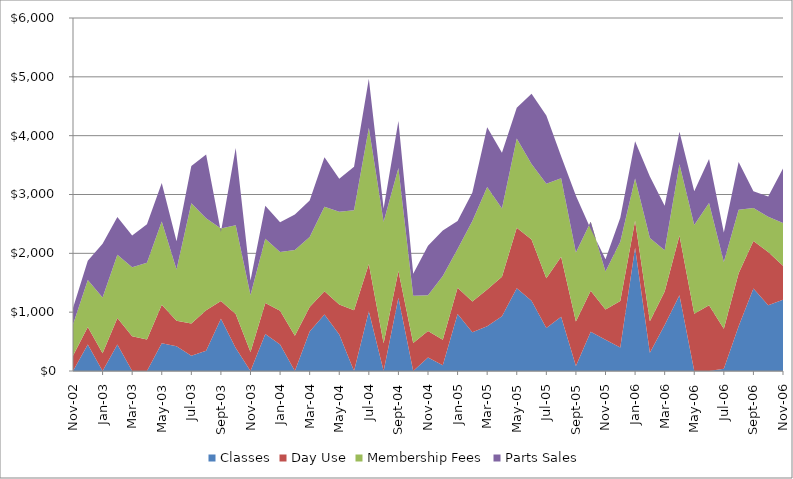
| Category | Classes | Day Use | Membership Fees | Parts Sales |
|---|---|---|---|---|
| 2002-11-30 | 0 | 260 | 532 | 277.02 |
| 2002-12-31 | 450 | 300 | 795 | 329.13 |
| 2003-01-31 | 0 | 300.23 | 947 | 913.68 |
| 2003-02-28 | 450 | 451 | 1075.06 | 642.99 |
| 2003-03-31 | 0 | 589 | 1175 | 539.37 |
| 2003-04-30 | 0 | 536.49 | 1302 | 654.8 |
| 2003-05-31 | 473.09 | 651 | 1418 | 653.2 |
| 2003-06-30 | 419.68 | 434 | 871 | 479.28 |
| 2003-07-31 | 257.61 | 549 | 2045 | 634.13 |
| 2003-08-31 | 345.45 | 685.5 | 1563.91 | 1084.85 |
| 2003-09-30 | 887.52 | 304 | 1230 | -58.87 |
| 2003-10-31 | 390 | 580 | 1507 | 1311.77 |
| 2003-11-30 | 0 | 325 | 965 | 250.24 |
| 2003-12-31 | 630 | 526 | 1091 | 562.84 |
| 2004-01-31 | 450 | 574 | 997 | 507.45 |
| 2004-02-29 | 0 | 598 | 1460 | 603.54 |
| 2004-03-31 | 670 | 418 | 1189 | 622 |
| 2004-04-30 | 960 | 396 | 1434 | 842.39 |
| 2004-05-31 | 620 | 510 | 1577 | 559.38 |
| 2004-06-30 | 0 | 1032.68 | 1698.14 | 738.73 |
| 2004-07-31 | 1015.19 | 805.04 | 2314.76 | 832.11 |
| 2004-08-31 | 0 | 470.34 | 2066.79 | 226.81 |
| 2004-09-30 | 1243.53 | 455.46 | 1749.35 | 801.28 |
| 2004-10-31 | 0 | 475.27 | 803.23 | 376.34 |
| 2004-11-30 | 230 | 451.49 | 606.5 | 839.46 |
| 2004-12-31 | 98.46 | 433.87 | 1082.52 | 771.46 |
| 2005-01-31 | 970 | 445.05 | 656.95 | 475.89 |
| 2005-02-28 | 660 | 520.07 | 1371.01 | 482.73 |
| 2005-03-31 | 760 | 627.28 | 1741.91 | 1012.32 |
| 2005-04-30 | 930 | 673.14 | 1158.53 | 948.78 |
| 2005-05-31 | 1408.4 | 1027 | 1516.02 | 523.92 |
| 2005-06-30 | 1194.49 | 1038.84 | 1283.72 | 1194.57 |
| 2005-07-31 | 731.76 | 844.97 | 1604.43 | 1161.1 |
| 2005-08-31 | 923.31 | 1017.09 | 1335.64 | 373.94 |
| 2005-09-30 | 86.81 | 752.93 | 1172.6 | 966.59 |
| 2005-10-31 | 667.66 | 697.14 | 1172.48 | -124.8 |
| 2005-11-30 | 532.29 | 511.63 | 647.79 | 206.83 |
| 2005-12-31 | 399 | 789.87 | 1006.42 | 407.93 |
| 2006-01-31 | 2096 | 457.38 | 719.62 | 631.86 |
| 2006-02-28 | 310.34 | 535.97 | 1415.27 | 1045.76 |
| 2006-03-31 | 780 | 572.45 | 698.06 | 756.65 |
| 2006-04-30 | 1288 | 1013.8 | 1212.42 | 551.13 |
| 2006-05-31 | 0 | 971.09 | 1508.7 | 573.87 |
| 2006-06-30 | 0 | 1116.26 | 1739.97 | 746.85 |
| 2006-07-31 | 40.26 | 679.29 | 1132.32 | 503.95 |
| 2006-08-31 | 759 | 903.72 | 1080 | 811.02 |
| 2006-09-30 | 1401.61 | 807.35 | 561.49 | 284.44 |
| 2006-10-31 | 1117.55 | 906.35 | 597.09 | 342.97 |
| 2006-11-30 | 1211.38 | 577.87 | 727.66 | 923.26 |